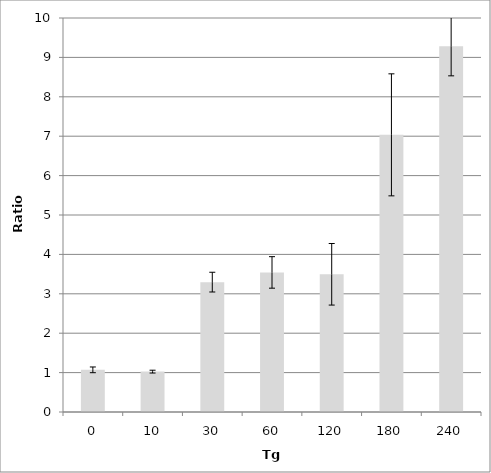
| Category | Series 0 |
|---|---|
| 0.0 | 1.07 |
| 10.0 | 1.025 |
| 30.0 | 3.296 |
| 60.0 | 3.543 |
| 120.0 | 3.495 |
| 180.0 | 7.034 |
| 240.0 | 9.283 |